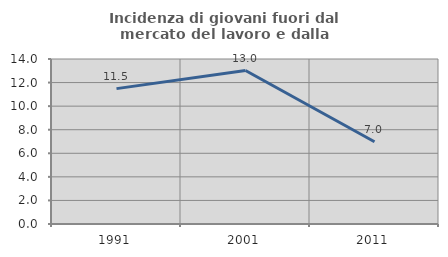
| Category | Incidenza di giovani fuori dal mercato del lavoro e dalla formazione  |
|---|---|
| 1991.0 | 11.486 |
| 2001.0 | 13.021 |
| 2011.0 | 6.977 |